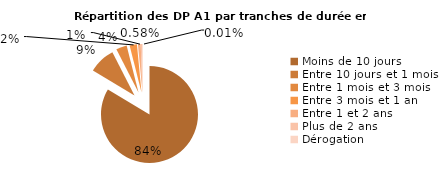
| Category | Series 0 |
|---|---|
| Moins de 10 jours | 125932 |
| Entre 10 jours et 1 mois | 13359 |
| Entre 1 mois et 3 mois | 5416 |
| Entre 3 mois et 1 an | 3661 |
| Entre 1 et 2 ans | 1388 |
| Plus de 2 ans | 877 |
| Dérogation | 11 |